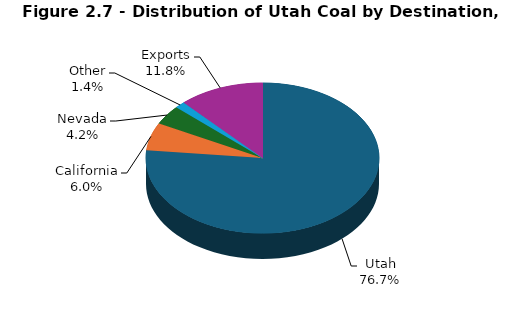
| Category | Series 0 |
|---|---|
| Utah | 10100.867 |
| California | 786.218 |
| Nevada | 548.386 |
| Other | 186.435 |
| Exports | 1554 |